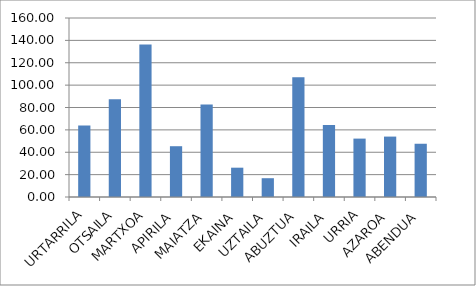
| Category | Series 0 |
|---|---|
| URTARRILA | 63.8 |
| OTSAILA | 87.3 |
| MARTXOA | 136.3 |
| APIRILA | 45.4 |
| MAIATZA | 82.7 |
| EKAINA | 26.2 |
| UZTAILA | 16.8 |
| ABUZTUA | 107 |
| IRAILA | 64.3 |
| URRIA | 52.2 |
| AZAROA | 54 |
| ABENDUA | 47.6 |